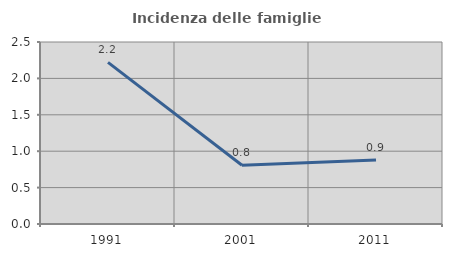
| Category | Incidenza delle famiglie numerose |
|---|---|
| 1991.0 | 2.22 |
| 2001.0 | 0.806 |
| 2011.0 | 0.878 |